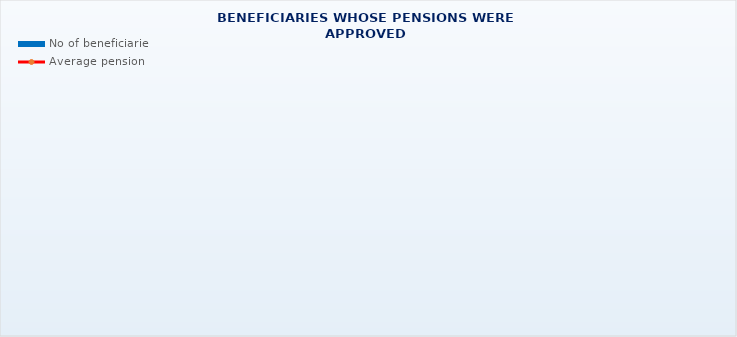
| Category | No of beneficiaries |
|---|---|
| Authorised officials in internal affairs, judicial officers and workers engaged in demining work: | 17264 |
| Pension beneficiaries entitled under the Fire Services Act (Official Gazette 125/19) | 280 |
| Active military personnel - DVO  | 16025 |
| Croatian Homeland Army veterans mobilised from 1941 to 1945 | 2362 |
| Former political prisoners | 2293 |
| Croatian Veterans from the Homeland War - ZOHBDR (Act on Croatian Homeland War Veterans and Their Family Members) | 71068 |
| Pensions approved under general regulations and determined according to the Act on the Rights of Croatian Homeland War Veterans and their Family Members (ZOHBDR), in 2017 (Art. 27, 35, 48 and 49, paragraph 2)    | 54217 |
| Former Yugoslav People's Army members - JNA   | 4121 |
| Former Yugoslav People's Army members - JNA - Art. 185 of Pension Insurance Act (ZOMO)  | 158 |
| National Liberation War veterans - NOR | 5997 |
| Members of the Croatian Parliament, members of the Government, judges of the Constitutional Court and the Auditor General | 687 |
| Members of the Parliamentary Executive Council and administratively retired federal civil servants  (relates to the former SFRY) | 70 |
| Former officials of federal bodies o the former SFRJ -  Article 38 of the Pension Insurance Act (ZOMO) | 22 |
| Full members of the Croatian Academy of Sciences and Arts - HAZU | 130 |
| Miners from the Istrian coal mines "Tupljak" d.d. Labin  | 249 |
| Workers professionally exposed to asbestos | 837 |
| Insurees - crew members on a ship in international and national navigation  - Article  129, paragraph 2 of the Maritime Code | 201 |
| Members of the Croatian Defence Council - HVO  | 6762 |